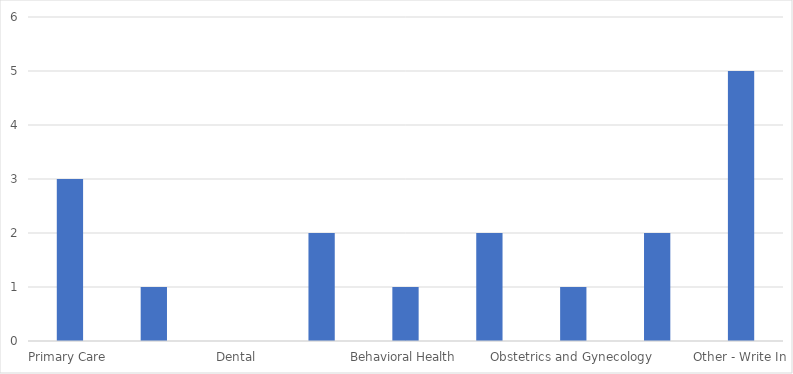
| Category | Number of Responses |
|---|---|
| Primary Care | 3 |
| Pediatrics | 1 |
| Dental | 0 |
| Preventative Medicine | 2 |
| Behavioral Health | 1 |
| Surgery | 2 |
| Obstetrics and Gynecology | 1 |
| Public Health | 2 |
| Other - Write In | 5 |